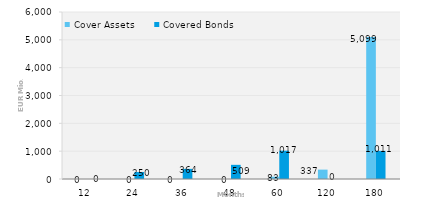
| Category | Cover Assets | Covered Bonds |
|---|---|---|
| 12.0 | 0 | 0 |
| 24.0 | 0 | 250 |
| 36.0 | 0 | 364 |
| 48.0 | 0 | 509 |
| 60.0 | 82.78 | 1017 |
| 120.0 | 336.6 | 0 |
| 180.0 | 5099.1 | 1011 |